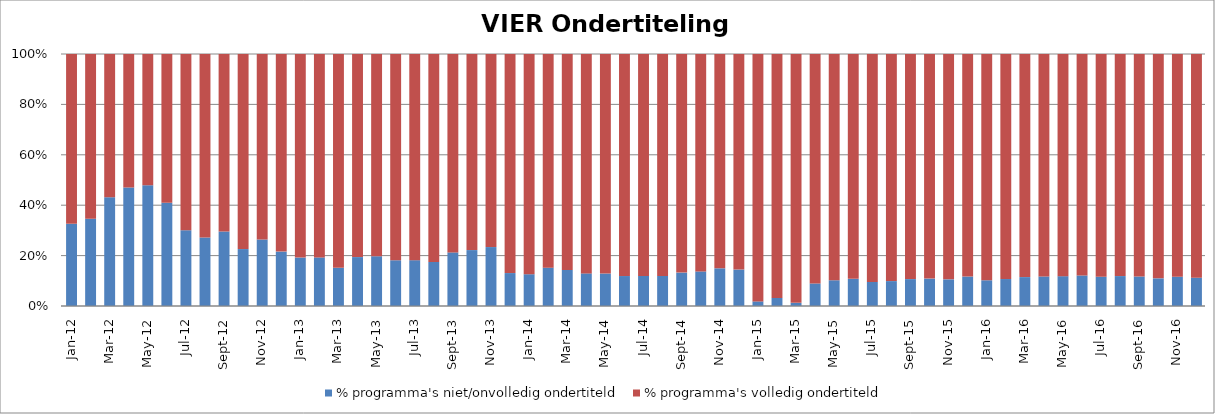
| Category | % programma's niet/onvolledig ondertiteld | % programma's volledig ondertiteld |
|---|---|---|
| 2012-01-01 | 0.326 | 0.674 |
| 2012-02-01 | 0.347 | 0.653 |
| 2012-03-01 | 0.432 | 0.568 |
| 2012-04-01 | 0.47 | 0.53 |
| 2012-05-01 | 0.48 | 0.52 |
| 2012-06-01 | 0.41 | 0.59 |
| 2012-07-01 | 0.301 | 0.699 |
| 2012-08-01 | 0.272 | 0.728 |
| 2012-09-01 | 0.296 | 0.704 |
| 2012-10-01 | 0.226 | 0.774 |
| 2012-11-01 | 0.264 | 0.736 |
| 2012-12-01 | 0.216 | 0.784 |
| 2013-01-01 | 0.192 | 0.808 |
| 2013-02-01 | 0.193 | 0.807 |
| 2013-03-01 | 0.151 | 0.849 |
| 2013-04-01 | 0.194 | 0.806 |
| 2013-05-01 | 0.197 | 0.803 |
| 2013-06-01 | 0.182 | 0.818 |
| 2013-07-01 | 0.182 | 0.818 |
| 2013-08-01 | 0.175 | 0.825 |
| 2013-09-01 | 0.213 | 0.787 |
| 2013-10-01 | 0.222 | 0.778 |
| 2013-11-01 | 0.234 | 0.766 |
| 2013-12-01 | 0.131 | 0.869 |
| 2014-01-01 | 0.126 | 0.874 |
| 2014-02-01 | 0.152 | 0.848 |
| 2014-03-01 | 0.143 | 0.857 |
| 2014-04-01 | 0.129 | 0.871 |
| 2014-05-01 | 0.129 | 0.871 |
| 2014-06-01 | 0.119 | 0.881 |
| 2014-07-01 | 0.12 | 0.88 |
| 2014-08-01 | 0.119 | 0.881 |
| 2014-09-01 | 0.132 | 0.868 |
| 2014-10-01 | 0.137 | 0.863 |
| 2014-11-01 | 0.15 | 0.85 |
| 2014-12-01 | 0.145 | 0.855 |
| 2015-01-01 | 0.018 | 0.982 |
| 2015-02-01 | 0.032 | 0.968 |
| 2015-03-01 | 0.012 | 0.988 |
| 2015-04-01 | 0.089 | 0.911 |
| 2015-05-01 | 0.102 | 0.898 |
| 2015-06-01 | 0.108 | 0.892 |
| 2015-07-01 | 0.095 | 0.905 |
| 2015-08-01 | 0.099 | 0.901 |
| 2015-09-01 | 0.107 | 0.893 |
| 2015-10-01 | 0.109 | 0.891 |
| 2015-11-01 | 0.106 | 0.894 |
| 2015-12-01 | 0.117 | 0.883 |
| 2016-01-01 | 0.102 | 0.898 |
| 2016-02-01 | 0.107 | 0.893 |
| 2016-03-01 | 0.115 | 0.885 |
| 2016-04-01 | 0.117 | 0.883 |
| 2016-05-01 | 0.118 | 0.882 |
| 2016-06-01 | 0.121 | 0.879 |
| 2016-07-01 | 0.116 | 0.884 |
| 2016-08-01 | 0.119 | 0.881 |
| 2016-09-01 | 0.117 | 0.883 |
| 2016-10-01 | 0.11 | 0.89 |
| 2016-11-01 | 0.116 | 0.884 |
| 2016-12-01 | 0.112 | 0.888 |